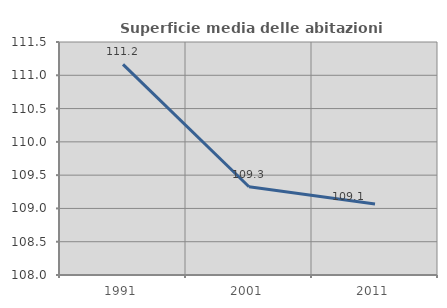
| Category | Superficie media delle abitazioni occupate |
|---|---|
| 1991.0 | 111.165 |
| 2001.0 | 109.326 |
| 2011.0 | 109.066 |